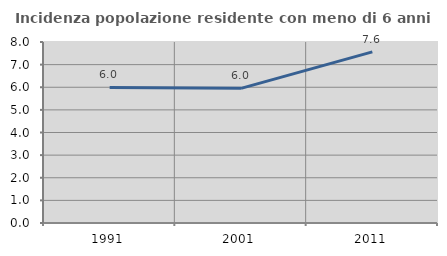
| Category | Incidenza popolazione residente con meno di 6 anni |
|---|---|
| 1991.0 | 5.991 |
| 2001.0 | 5.952 |
| 2011.0 | 7.562 |